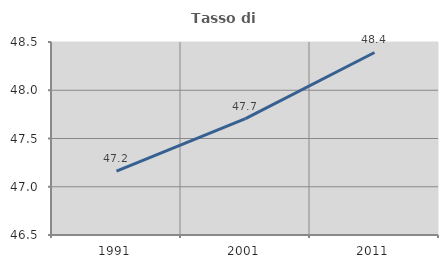
| Category | Tasso di occupazione   |
|---|---|
| 1991.0 | 47.163 |
| 2001.0 | 47.706 |
| 2011.0 | 48.391 |